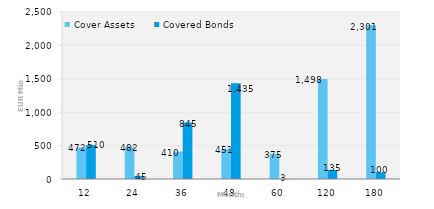
| Category | Cover Assets | Covered Bonds |
|---|---|---|
| 12.0 | 471.99 | 510 |
| 24.0 | 482.413 | 45 |
| 36.0 | 409.988 | 845 |
| 48.0 | 451.406 | 1435 |
| 60.0 | 375.377 | 3 |
| 120.0 | 1497.841 | 135 |
| 180.0 | 2301.348 | 100 |